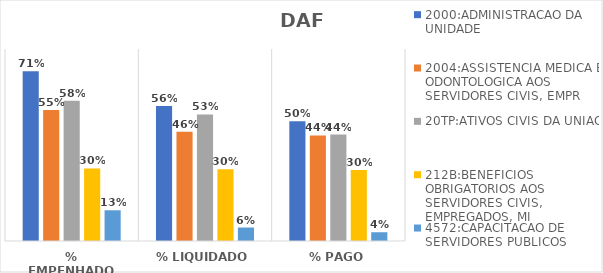
| Category | 2000:ADMINISTRACAO DA UNIDADE | 2004:ASSISTENCIA MEDICA E ODONTOLOGICA AOS SERVIDORES CIVIS, EMPR | 20TP:ATIVOS CIVIS DA UNIAO | 212B:BENEFICIOS OBRIGATORIOS AOS SERVIDORES CIVIS, EMPREGADOS, MI | 4572:CAPACITACAO DE SERVIDORES PUBLICOS FEDERAIS EM PROCESSO DE Q |
|---|---|---|---|---|---|
| % EMPENHADO | 0.707 | 0.545 | 0.585 | 0.303 | 0.128 |
| % LIQUIDADO | 0.562 | 0.456 | 0.527 | 0.299 | 0.056 |
| % PAGO | 0.499 | 0.44 | 0.444 | 0.296 | 0.037 |